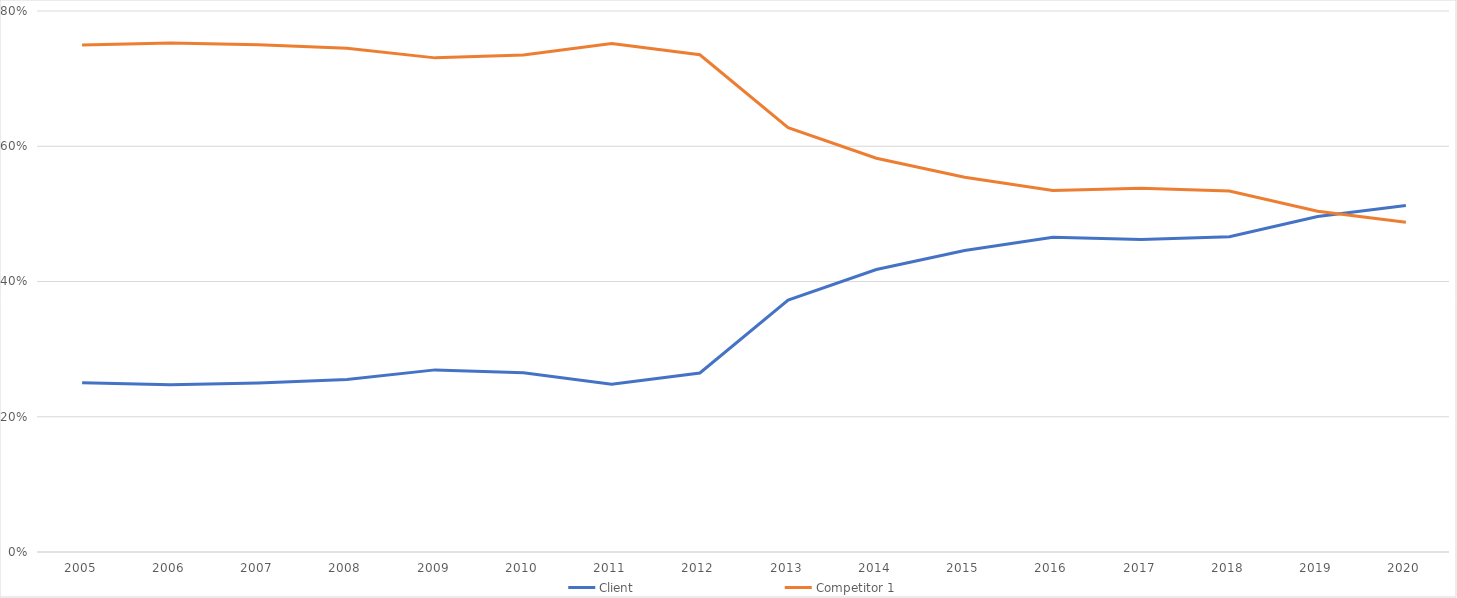
| Category | Client | Competitor 1 |
|---|---|---|
| 2005.0 | 0.25 | 0.75 |
| 2006.0 | 0.247 | 0.753 |
| 2007.0 | 0.25 | 0.75 |
| 2008.0 | 0.255 | 0.745 |
| 2009.0 | 0.269 | 0.731 |
| 2010.0 | 0.265 | 0.735 |
| 2011.0 | 0.248 | 0.752 |
| 2012.0 | 0.265 | 0.735 |
| 2013.0 | 0.373 | 0.627 |
| 2014.0 | 0.418 | 0.582 |
| 2015.0 | 0.446 | 0.554 |
| 2016.0 | 0.465 | 0.535 |
| 2017.0 | 0.462 | 0.538 |
| 2018.0 | 0.466 | 0.534 |
| 2019.0 | 0.496 | 0.504 |
| 2020.0 | 0.513 | 0.487 |